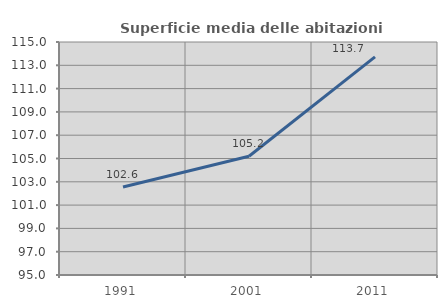
| Category | Superficie media delle abitazioni occupate |
|---|---|
| 1991.0 | 102.554 |
| 2001.0 | 105.192 |
| 2011.0 | 113.72 |